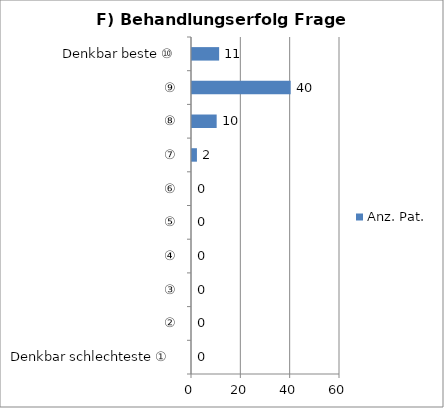
| Category | Anz. Pat. |
|---|---|
| Denkbar schlechteste ①  | 0 |
| ② | 0 |
| ③ | 0 |
| ④ | 0 |
| ⑤ | 0 |
| ⑥ | 0 |
| ⑦ | 2 |
| ⑧ | 10 |
| ⑨ | 40 |
| Denkbar beste ⑩ | 11 |